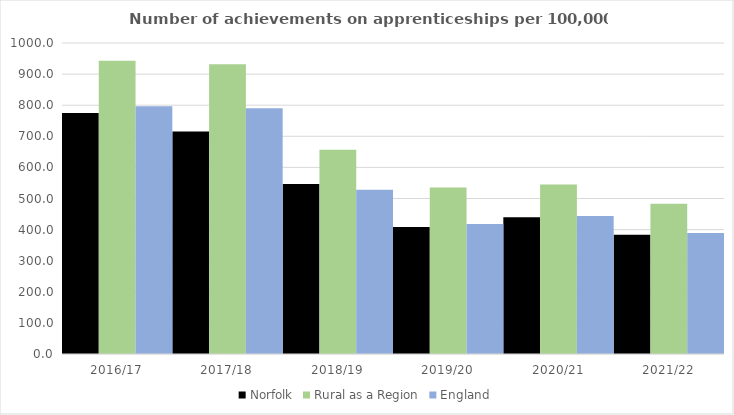
| Category | Norfolk | Rural as a Region | England |
|---|---|---|---|
| 2016/17 | 774.831 | 942.594 | 797 |
| 2017/18 | 715.664 | 931.709 | 790 |
| 2018/19 | 546.408 | 656.44 | 528 |
| 2019/20 | 408.657 | 535.552 | 418 |
| 2020/21 | 439.497 | 545.333 | 444 |
| 2021/22 | 383.207 | 482.936 | 389 |